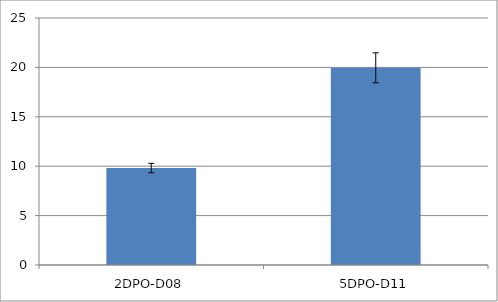
| Category | Series 0 |
|---|---|
| 2DPO-D08 | 9.813 |
| 5DPO-D11 | 19.96 |